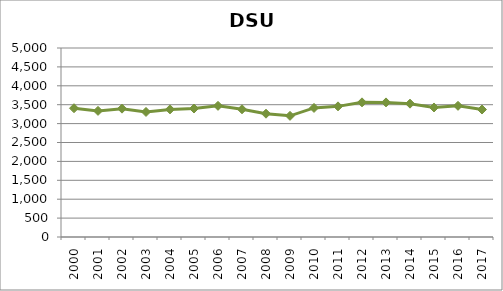
| Category | Series 0 |
|---|---|
| 2000.0 | 3406.242 |
| 2001.0 | 3336.7 |
| 2002.0 | 3395.367 |
| 2003.0 | 3308.45 |
| 2004.0 | 3375.958 |
| 2005.0 | 3398.8 |
| 2006.0 | 3470.108 |
| 2007.0 | 3378.633 |
| 2008.0 | 3261.975 |
| 2009.0 | 3205.108 |
| 2010.0 | 3414.367 |
| 2011.0 | 3455.925 |
| 2012.0 | 3562.233 |
| 2013.0 | 3560.35 |
| 2014.0 | 3527.3 |
| 2015.0 | 3426.667 |
| 2016.0 | 3470.517 |
| 2017.0 | 3372.342 |